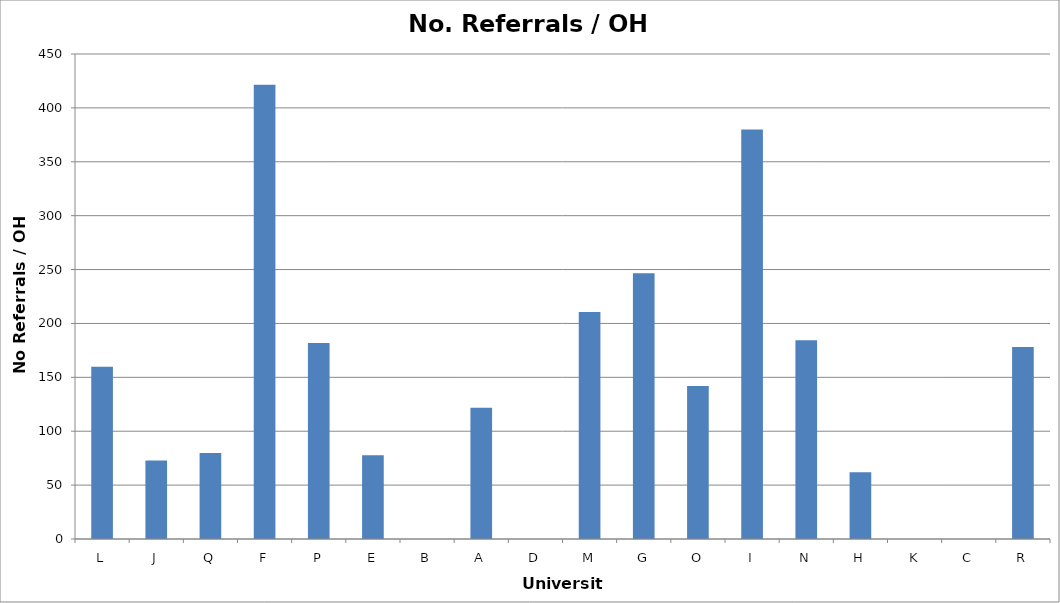
| Category | No. Referrals / OH FTE |
|---|---|
| L | 159.744 |
| J | 72.889 |
| Q | 79.722 |
| F | 421.395 |
| P | 181.905 |
| E | 77.679 |
| B | 0 |
| A | 121.739 |
| D | 0 |
| M | 210.526 |
| G | 246.552 |
| O | 141.905 |
| I | 380 |
| N | 184.444 |
| H | 61.892 |
| K | 0 |
| C | 0 |
| R | 178.039 |